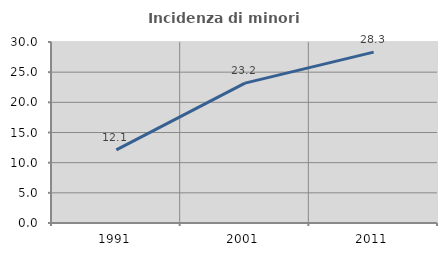
| Category | Incidenza di minori stranieri |
|---|---|
| 1991.0 | 12.121 |
| 2001.0 | 23.188 |
| 2011.0 | 28.328 |